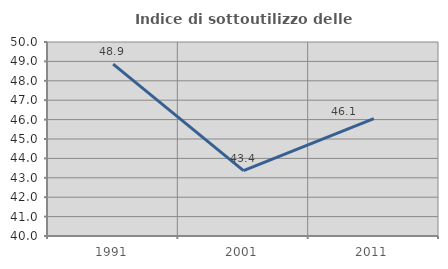
| Category | Indice di sottoutilizzo delle abitazioni  |
|---|---|
| 1991.0 | 48.864 |
| 2001.0 | 43.373 |
| 2011.0 | 46.053 |